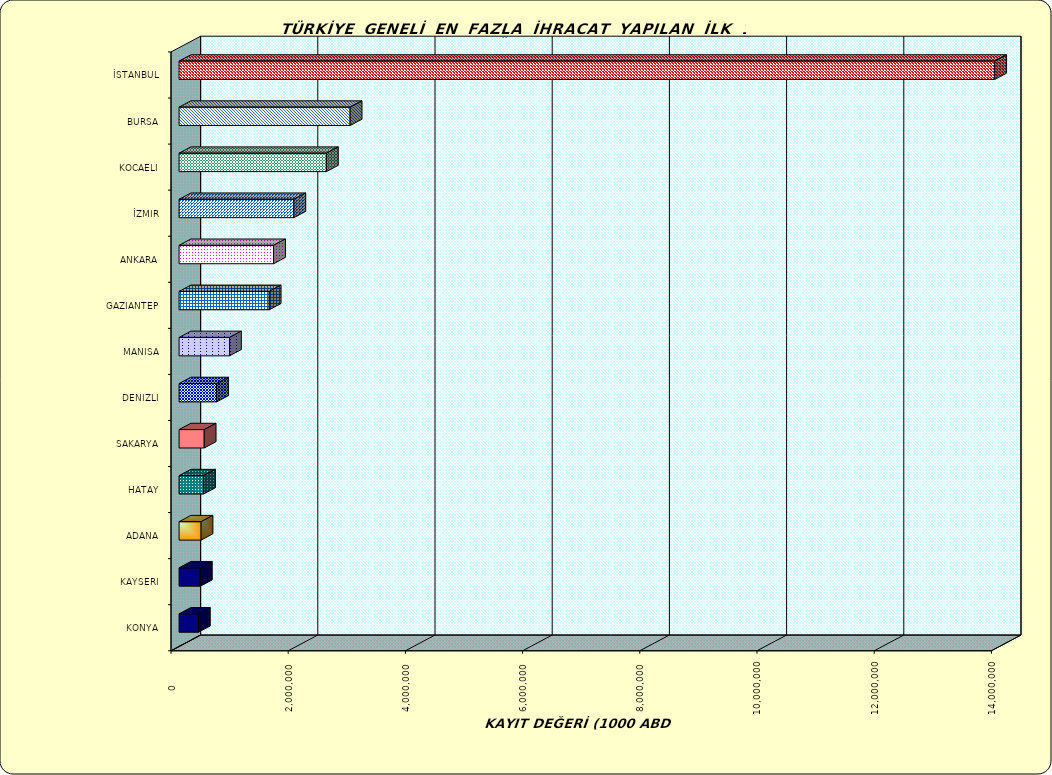
| Category | Series 0 |
|---|---|
| İSTANBUL | 13919070.35 |
| BURSA | 2919309.738 |
| KOCAELI | 2514502.184 |
| İZMIR | 1959539.268 |
| ANKARA | 1612595.714 |
| GAZIANTEP | 1538409.192 |
| MANISA | 860522.826 |
| DENIZLI | 639366.935 |
| SAKARYA | 428892.552 |
| HATAY | 417420.439 |
| ADANA | 375443.045 |
| KAYSERI | 363133.669 |
| KONYA | 329691.112 |